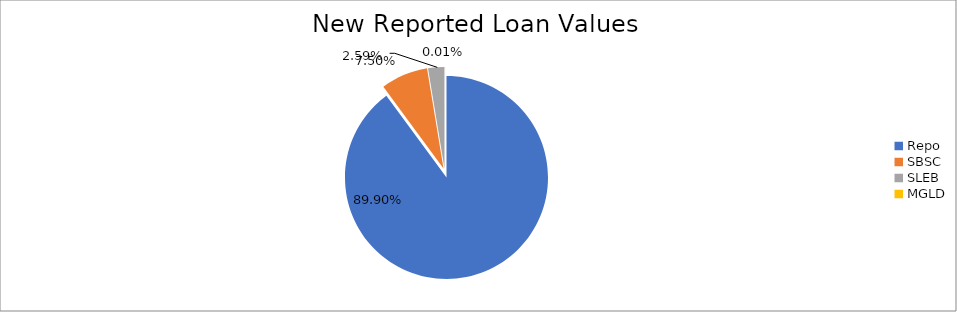
| Category | Series 0 |
|---|---|
| Repo | 10914869.579 |
| SBSC | 910240.155 |
| SLEB | 314652.617 |
| MGLD | 800.23 |